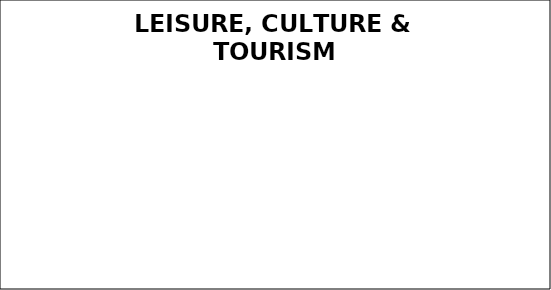
| Category | Q2 |
|---|---|
| Green | 0 |
| Amber | 0 |
| Red | 0 |